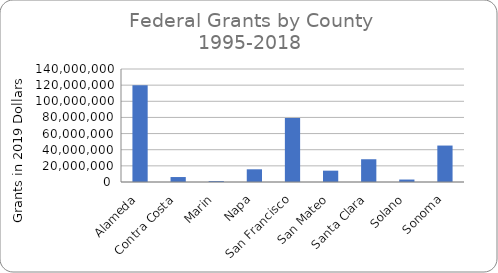
| Category | Series 0 |
|---|---|
| Alameda | 119821116.116 |
| Contra Costa | 6143868 |
| Marin | 1160351.09 |
| Napa | 15727250 |
| San Francisco | 79416743 |
| San Mateo | 14040197.974 |
| Santa Clara | 28188131.789 |
| Solano | 3040512 |
| Sonoma | 45152824 |